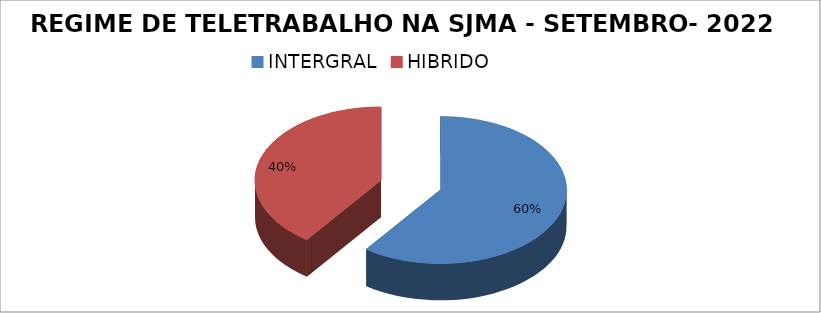
| Category | Series 0 |
|---|---|
| INTERGRAL | 72 |
| HIBRIDO | 48 |